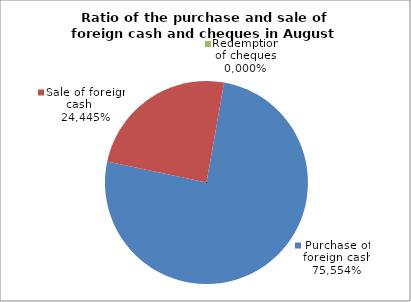
| Category | Purchase of foreign cash |
|---|---|
| 0 | 0.756 |
| 1 | 0.244 |
| 2 | 0 |